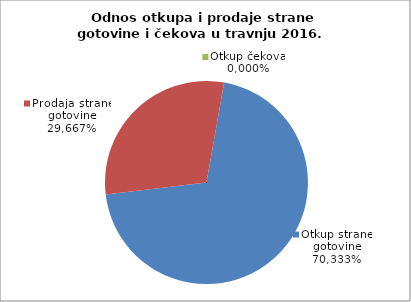
| Category | Otkup strane gotovine |
|---|---|
| 0 | 0.703 |
| 1 | 0.297 |
| 2 | 0 |